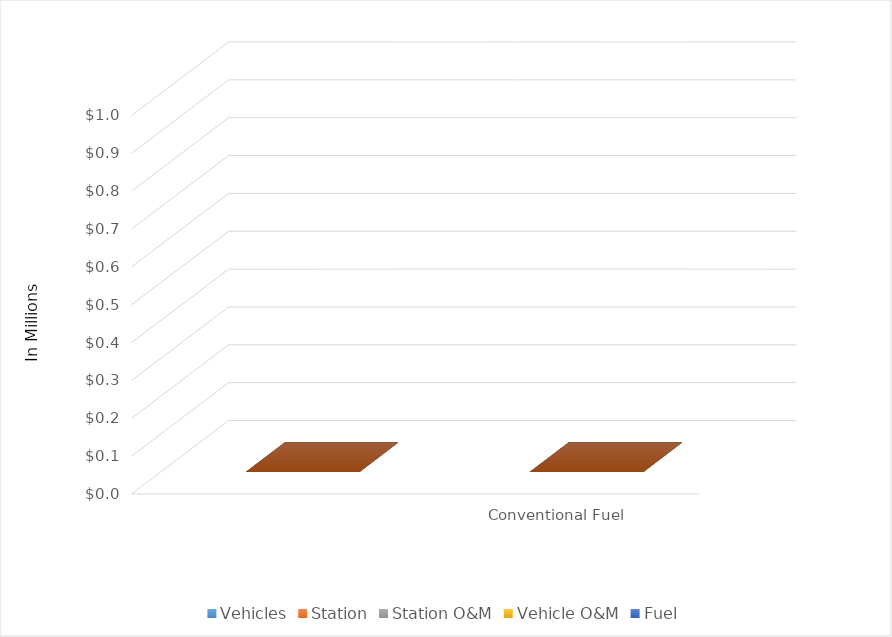
| Category | Vehicles | Station | Station O&M | Vehicle O&M | Fuel |
|---|---|---|---|---|---|
|   | 0 | 0 | 0 | 0 | 0 |
| Conventional Fuel | 0 | 0 | 0 | 0 | 0 |